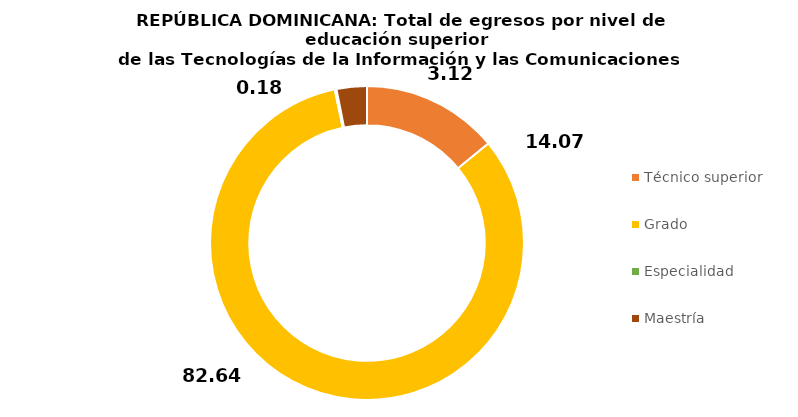
| Category | Series 0 |
|---|---|
| Técnico superior | 14.067 |
| Grado | 82.637 |
| Especialidad | 0.177 |
| Maestría | 3.119 |